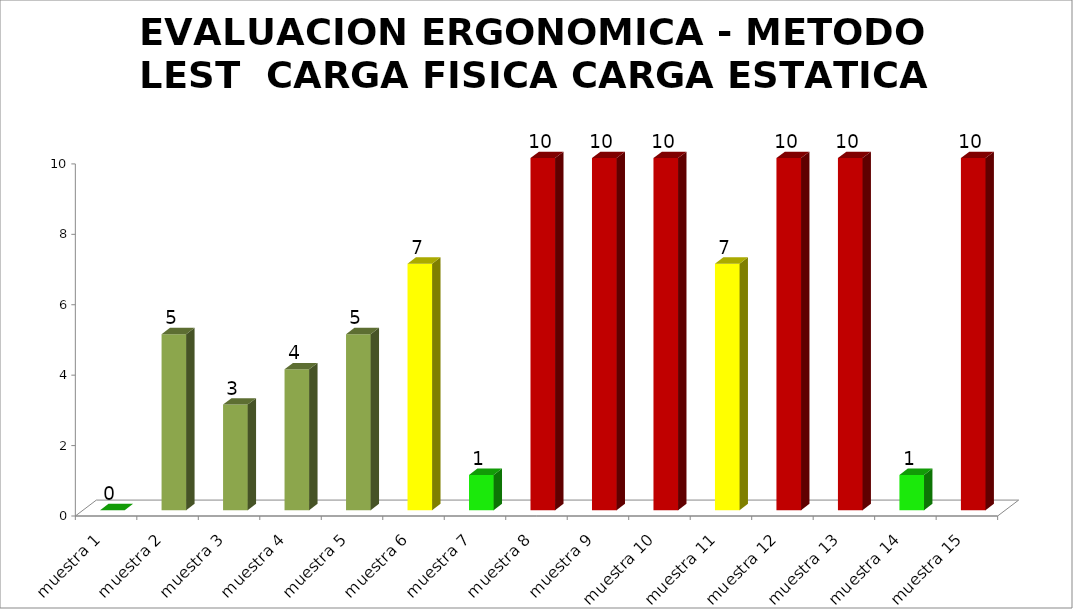
| Category | EVALUACION ERGONOMICA - METODO LEST  |
|---|---|
| muestra 1 | 0 |
| muestra 2 | 5 |
| muestra 3 | 3 |
| muestra 4 | 4 |
| muestra 5 | 5 |
| muestra 6 | 7 |
| muestra 7 | 1 |
| muestra 8 | 10 |
| muestra 9 | 10 |
| muestra 10 | 10 |
| muestra 11 | 7 |
| muestra 12 | 10 |
| muestra 13 | 10 |
| muestra 14 | 1 |
| muestra 15 | 10 |